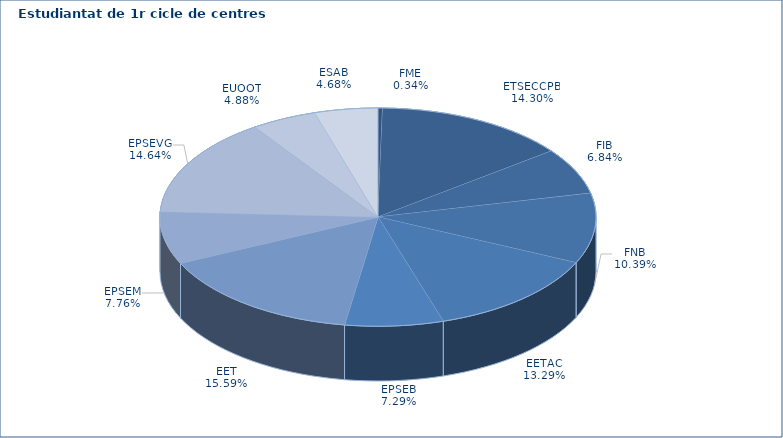
| Category | Series 0 |
|---|---|
| FME | 15 |
| ETSECCPB | 636 |
| FIB | 304 |
| FNB | 462 |
| EETAC | 591 |
| EPSEB | 324 |
| EET | 693 |
| EPSEM | 345 |
| EPSEVG | 651 |
| EUOOT | 217 |
| ESAB | 208 |